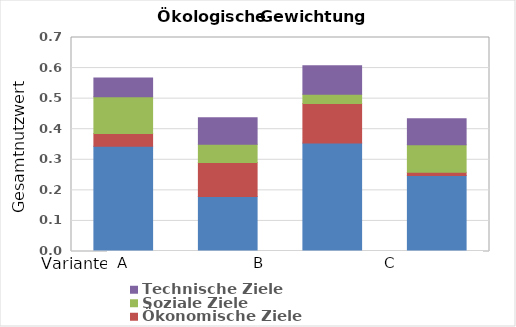
| Category | Umwelt- und Ressourcenschutz | Ökonomische Ziele | Soziale Ziele | Technische Ziele |
|---|---|---|---|---|
| 0 | 0.345 | 0.041 | 0.12 | 0.062 |
| 1 | 0.18 | 0.111 | 0.06 | 0.086 |
| 2 | 0.355 | 0.129 | 0.03 | 0.094 |
| 3 | 0.249 | 0.01 | 0.09 | 0.085 |